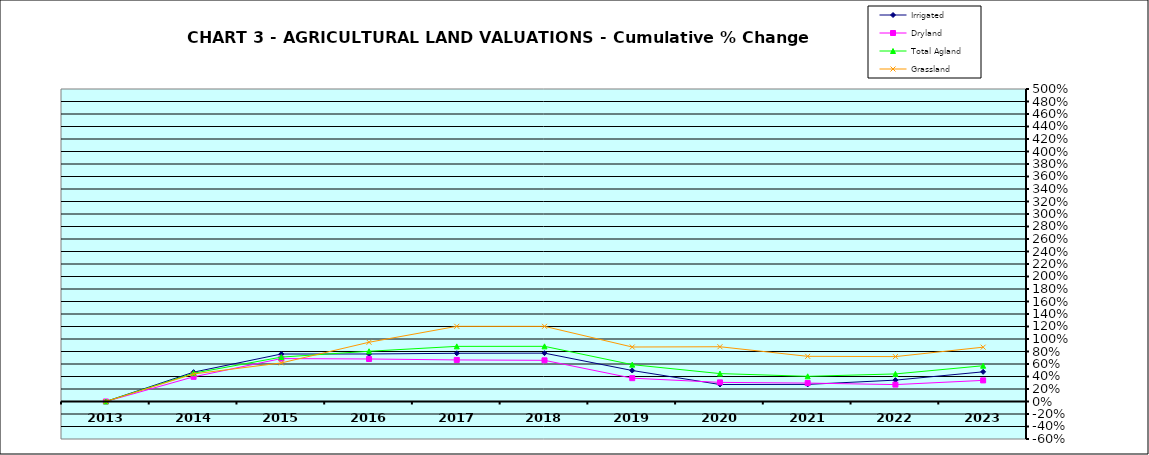
| Category | Irrigated | Dryland | Total Agland | Grassland |
|---|---|---|---|---|
| 2013.0 | 0 | 0 | 0 | 0 |
| 2014.0 | 0.47 | 0.394 | 0.453 | 0.441 |
| 2015.0 | 0.76 | 0.687 | 0.71 | 0.617 |
| 2016.0 | 0.76 | 0.68 | 0.804 | 0.948 |
| 2017.0 | 0.772 | 0.665 | 0.882 | 1.203 |
| 2018.0 | 0.774 | 0.659 | 0.883 | 1.202 |
| 2019.0 | 0.496 | 0.373 | 0.59 | 0.872 |
| 2020.0 | 0.272 | 0.306 | 0.447 | 0.876 |
| 2021.0 | 0.274 | 0.295 | 0.403 | 0.723 |
| 2022.0 | 0.342 | 0.27 | 0.441 | 0.718 |
| 2023.0 | 0.475 | 0.338 | 0.572 | 0.869 |